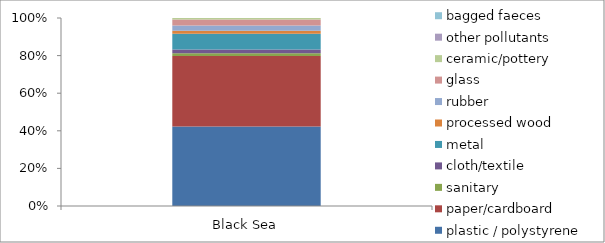
| Category | plastic / polystyrene | paper/cardboard | sanitary | cloth/textile | metal | processed wood | rubber | glass | ceramic/pottery | other pollutants | bagged faeces |
|---|---|---|---|---|---|---|---|---|---|---|---|
| Black Sea | 2702 | 2398 | 86 | 133 | 531 | 108 | 172 | 208 | 49 | 0 | 0 |